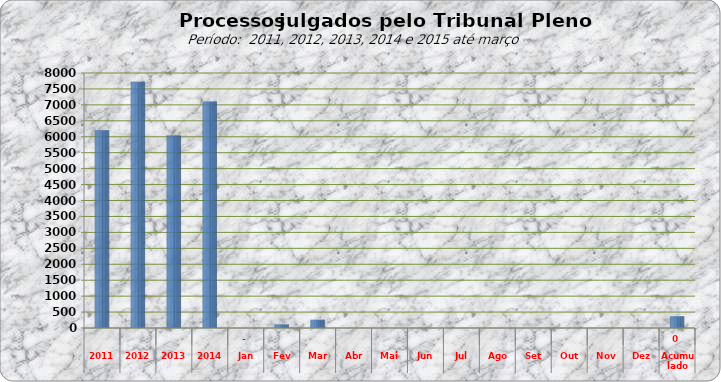
| Category | 6205 7722 6043  7.108  0 113 258 0 0 0 0 0 0 0 0 0 |
|---|---|
| 2011 | 6205 |
| 2012 | 7722 |
| 2013 | 6043 |
| 2014 | 7108 |
| Jan | 0 |
| Fev | 113 |
| Mar | 258 |
| Abr | 0 |
| Mai | 0 |
| Jun | 0 |
| Jul | 0 |
| Ago | 0 |
| Set | 0 |
| Out | 0 |
| Nov | 0 |
| Dez | 0 |
| Acumulado | 371 |